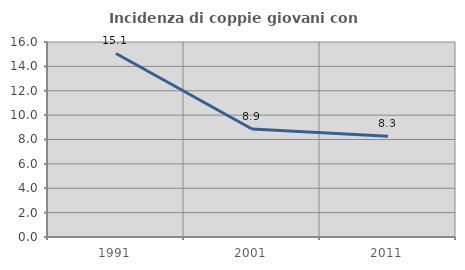
| Category | Incidenza di coppie giovani con figli |
|---|---|
| 1991.0 | 15.057 |
| 2001.0 | 8.859 |
| 2011.0 | 8.266 |